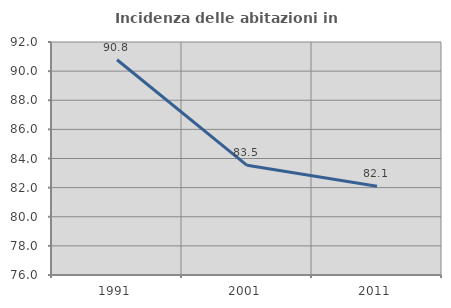
| Category | Incidenza delle abitazioni in proprietà  |
|---|---|
| 1991.0 | 90.78 |
| 2001.0 | 83.529 |
| 2011.0 | 82.09 |